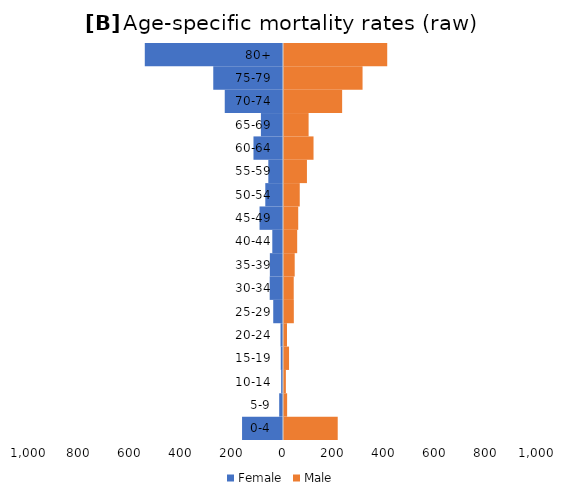
| Category | Female | Male |
|---|---|---|
| 0-4 | -161.194 | 211.501 |
| 5-9 | -15.002 | 12.321 |
| 10-14 | -7.315 | 7.402 |
| 15-19 | -8.807 | 19.818 |
| 20-24 | -9.761 | 11.862 |
| 25-29 | -38.464 | 38.685 |
| 30-34 | -52.352 | 38.319 |
| 35-39 | -51.733 | 42.125 |
| 40-44 | -42.148 | 51.917 |
| 45-49 | -92.317 | 55.983 |
| 50-54 | -69.738 | 62.01 |
| 55-59 | -57.793 | 90.332 |
| 60-64 | -116.245 | 116.238 |
| 65-69 | -86.992 | 96.868 |
| 70-74 | -229.332 | 228.882 |
| 75-79 | -274.549 | 309.266 |
| 80+ | -544.137 | 406.373 |